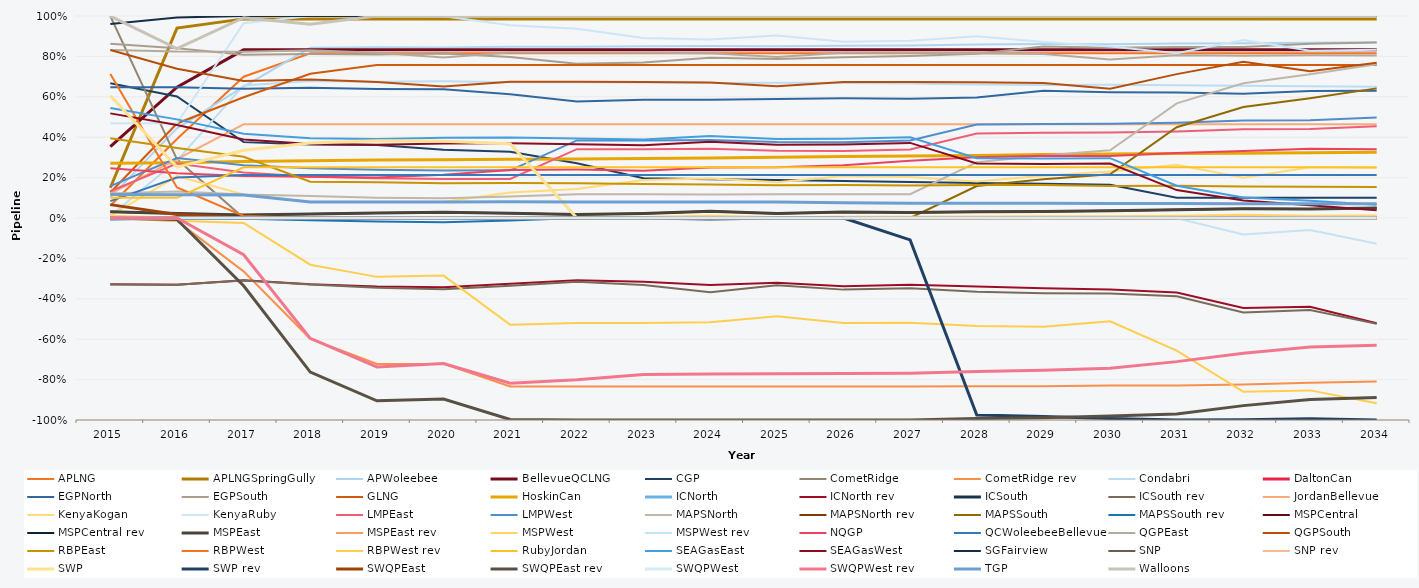
| Category | APLNG | APLNGSpringGully | APWoleebee | BellevueQCLNG | CGP | CometRidge | CometRidge rev | Condabri | DaltonCan | EGPNorth | EGPSouth | GLNG | HoskinCan | ICNorth | ICNorth rev | ICSouth | ICSouth rev | JordanBellevue | KenyaKogan | KenyaRuby | LMPEast | LMPWest | MAPSNorth | MAPSNorth rev | MAPSSouth | MAPSSouth rev | MSPCentral | MSPCentral rev | MSPEast | MSPEast rev | MSPWest | MSPWest rev | NQGP | QCWoleebeeBellevue | QGPEast | QGPSouth | RBPEast | RBPWest | RBPWest rev | RubyJordan | SEAGasEast | SEAGasWest | SGFairview | SNP | SNP rev | SWP | SWP rev | SWQPEast | SWQPEast rev | SWQPWest | SWQPWest rev | TGP | Walloons |
|---|---|---|---|---|---|---|---|---|---|---|---|---|---|---|---|---|---|---|---|---|---|---|---|---|---|---|---|---|---|---|---|---|---|---|---|---|---|---|---|---|---|---|---|---|---|---|---|---|---|---|---|---|---|
| 2015.0 | 0.061 | 0.15 | 0.102 | 0.353 | 0.667 | 1 | 0 | 0.01 | 0 | 0.647 | 0.863 | 0.127 | 0.272 | 0 | -0.328 | 0 | -0.329 | 0.12 | 0.011 | 0.469 | 0.132 | 0.158 | 0.121 | 0 | 0.001 | -0.007 | 0.031 | 0 | 0.031 | 0 | 0.011 | 0 | 0.247 | 0.083 | 0.832 | 0.832 | 0.395 | 0.713 | 0 | 0.1 | 0.545 | 0.518 | 0.961 | 0 | 0 | 0.605 | 0 | 0.066 | 0 | 0 | 0 | 0.117 | 0.999 |
| 2016.0 | 0.391 | 0.94 | 0.444 | 0.648 | 0.602 | 0.29 | -0.015 | 0.284 | 0 | 0.647 | 0.841 | 0.468 | 0.273 | 0 | -0.33 | 0 | -0.33 | 0.292 | 0.208 | 0.469 | 0.269 | 0.297 | 0.132 | 0 | 0 | -0.002 | 0.022 | 0 | 0.022 | 0 | 0.001 | 0 | 0.222 | 0.2 | 0.824 | 0.739 | 0.346 | 0.151 | -0.014 | 0.1 | 0.488 | 0.46 | 0.993 | 0 | 0 | 0.252 | 0 | 0.017 | -0.007 | 0 | 0 | 0.115 | 0.839 |
| 2017.0 | 0.7 | 0.986 | 0.651 | 0.833 | 0.376 | 0 | -0.264 | 0.656 | 0 | 0.64 | 0.809 | 0.597 | 0.28 | 0 | -0.309 | 0 | -0.309 | 0.464 | 0.116 | 0.964 | 0.225 | 0.261 | 0.116 | 0 | 0 | -0.004 | 0.015 | 0 | 0.015 | 0 | 0 | 0 | 0.208 | 0.213 | 0.823 | 0.678 | 0.303 | 0.01 | -0.025 | 0.251 | 0.417 | 0.389 | 1 | 0 | 0 | 0.335 | 0 | 0 | -0.335 | 0 | -0.182 | 0.113 | 0.991 |
| 2018.0 | 0.816 | 0.986 | 0.842 | 0.833 | 0.363 | 0 | -0.598 | 0.678 | 0 | 0.644 | 0.812 | 0.714 | 0.284 | 0 | -0.328 | 0 | -0.33 | 0.464 | 0.08 | 1 | 0.204 | 0.246 | 0.109 | 0 | 0 | -0.011 | 0.02 | 0 | 0.02 | 0 | 0.001 | 0 | 0.204 | 0.213 | 0.83 | 0.685 | 0.18 | 0 | -0.231 | 0.251 | 0.395 | 0.367 | 1 | 0 | 0 | 0.371 | 0 | 0 | -0.763 | 0 | -0.596 | 0.079 | 0.96 |
| 2019.0 | 0.816 | 0.986 | 0.846 | 0.833 | 0.361 | 0 | -0.722 | 0.675 | 0 | 0.639 | 0.809 | 0.758 | 0.287 | 0 | -0.339 | 0 | -0.346 | 0.464 | 0.08 | 1 | 0.197 | 0.239 | 0.1 | 0 | 0 | -0.018 | 0.025 | 0 | 0.025 | 0 | 0.002 | 0 | 0.2 | 0.213 | 0.818 | 0.673 | 0.177 | 0 | -0.291 | 0.251 | 0.391 | 0.363 | 1 | 0 | 0 | 0.383 | 0 | 0 | -0.905 | 0 | -0.737 | 0.08 | 1 |
| 2020.0 | 0.816 | 0.986 | 0.844 | 0.833 | 0.338 | 0 | -0.722 | 0.676 | 0 | 0.638 | 0.814 | 0.758 | 0.288 | 0 | -0.343 | 0 | -0.353 | 0.464 | 0.081 | 0.999 | 0.193 | 0.236 | 0.098 | 0 | 0 | -0.02 | 0.029 | 0 | 0.029 | 0 | 0.004 | 0 | 0.214 | 0.213 | 0.795 | 0.65 | 0.172 | 0 | -0.285 | 0.251 | 0.397 | 0.369 | 1 | 0 | 0 | 0.38 | 0 | 0 | -0.897 | 0 | -0.721 | 0.08 | 1 |
| 2021.0 | 0.816 | 0.986 | 0.848 | 0.833 | 0.327 | 0 | -0.834 | 0.672 | 0 | 0.612 | 0.798 | 0.758 | 0.291 | 0 | -0.326 | 0 | -0.336 | 0.464 | 0.126 | 0.954 | 0.193 | 0.236 | 0.106 | 0 | 0 | -0.012 | 0.023 | 0 | 0.023 | 0 | 0.004 | 0 | 0.238 | 0.213 | 0.819 | 0.674 | 0.173 | 0 | -0.528 | 0.251 | 0.399 | 0.371 | 1 | 0 | 0 | 0.368 | 0 | 0 | -0.998 | 0 | -0.818 | 0.08 | 1 |
| 2022.0 | 0.816 | 0.986 | 0.848 | 0.833 | 0.271 | 0 | -0.834 | 0.672 | 0 | 0.576 | 0.763 | 0.758 | 0.292 | 0 | -0.308 | 0 | -0.315 | 0.464 | 0.144 | 0.936 | 0.341 | 0.384 | 0.118 | 0 | 0 | 0 | 0.018 | 0 | 0.018 | 0 | 0.002 | 0 | 0.24 | 0.213 | 0.819 | 0.674 | 0.172 | 0 | -0.52 | 0.251 | 0.393 | 0.365 | 1 | 0 | 0 | 0 | 0 | 0 | -1 | 0 | -0.8 | 0.08 | 1 |
| 2023.0 | 0.816 | 0.986 | 0.85 | 0.833 | 0.197 | 0 | -0.834 | 0.67 | 0 | 0.585 | 0.77 | 0.758 | 0.295 | 0 | -0.316 | 0 | -0.332 | 0.464 | 0.188 | 0.892 | 0.34 | 0.383 | 0.117 | 0 | 0 | 0 | 0.023 | 0 | 0.023 | 0 | 0.005 | 0 | 0.234 | 0.213 | 0.818 | 0.674 | 0.168 | 0 | -0.52 | 0.251 | 0.388 | 0.36 | 1 | 0 | 0 | 0 | 0 | 0 | -1 | 0 | -0.774 | 0.08 | 1 |
| 2024.0 | 0.816 | 0.986 | 0.852 | 0.833 | 0.192 | 0 | -0.834 | 0.669 | 0 | 0.586 | 0.793 | 0.758 | 0.297 | 0 | -0.332 | 0 | -0.367 | 0.464 | 0.196 | 0.884 | 0.343 | 0.386 | 0.117 | 0 | 0 | -0.001 | 0.033 | 0 | 0.033 | 0 | 0.011 | 0 | 0.251 | 0.213 | 0.816 | 0.671 | 0.165 | 0 | -0.516 | 0.251 | 0.406 | 0.377 | 1 | 0 | 0 | 0 | -0.005 | 0 | -1 | 0 | -0.773 | 0.079 | 1 |
| 2025.0 | 0.816 | 0.986 | 0.851 | 0.833 | 0.188 | 0 | -0.834 | 0.67 | 0 | 0.589 | 0.787 | 0.758 | 0.301 | 0 | -0.32 | 0 | -0.333 | 0.464 | 0.177 | 0.903 | 0.333 | 0.376 | 0.118 | 0 | 0 | 0 | 0.022 | 0 | 0.022 | 0 | 0.003 | 0 | 0.251 | 0.213 | 0.796 | 0.652 | 0.162 | 0 | -0.486 | 0.251 | 0.391 | 0.363 | 1 | 0 | 0 | 0 | 0 | 0 | -1 | 0 | -0.771 | 0.079 | 1 |
| 2026.0 | 0.816 | 0.986 | 0.852 | 0.833 | 0.183 | 0 | -0.834 | 0.668 | 0 | 0.593 | 0.795 | 0.758 | 0.304 | 0 | -0.338 | 0 | -0.355 | 0.464 | 0.208 | 0.872 | 0.331 | 0.375 | 0.118 | 0 | 0 | 0 | 0.029 | 0 | 0.029 | 0 | 0.006 | 0 | 0.261 | 0.213 | 0.818 | 0.673 | 0.163 | 0 | -0.519 | 0.251 | 0.393 | 0.364 | 1 | 0 | 0 | 0 | 0 | 0 | -1 | 0 | -0.77 | 0.076 | 1 |
| 2027.0 | 0.816 | 0.986 | 0.854 | 0.833 | 0.179 | 0 | -0.834 | 0.666 | 0 | 0.59 | 0.802 | 0.758 | 0.307 | 0 | -0.331 | 0 | -0.348 | 0.464 | 0.203 | 0.877 | 0.34 | 0.384 | 0.118 | 0 | 0 | 0 | 0.027 | 0 | 0.027 | 0 | 0.006 | 0 | 0.283 | 0.213 | 0.818 | 0.674 | 0.161 | 0 | -0.519 | 0.251 | 0.4 | 0.372 | 1 | 0 | 0 | 0 | -0.108 | 0 | -1 | 0 | -0.768 | 0.073 | 1 |
| 2028.0 | 0.816 | 0.986 | 0.859 | 0.833 | 0.174 | 0 | -0.833 | 0.661 | 0 | 0.596 | 0.813 | 0.758 | 0.31 | 0 | -0.34 | 0 | -0.366 | 0.464 | 0.18 | 0.9 | 0.418 | 0.462 | 0.276 | 0 | 0.158 | 0 | 0.031 | 0 | 0.031 | 0 | 0.008 | 0 | 0.301 | 0.213 | 0.816 | 0.671 | 0.163 | 0 | -0.534 | 0.251 | 0.296 | 0.27 | 1 | 0 | 0 | 0 | -0.975 | 0 | -0.993 | 0 | -0.759 | 0.073 | 1 |
| 2029.0 | 0.816 | 0.986 | 0.861 | 0.833 | 0.17 | 0 | -0.833 | 0.659 | 0 | 0.63 | 0.849 | 0.758 | 0.314 | 0 | -0.348 | 0 | -0.372 | 0.464 | 0.209 | 0.871 | 0.421 | 0.465 | 0.31 | 0 | 0.191 | 0 | 0.033 | 0 | 0.033 | 0 | 0.008 | -0.002 | 0.309 | 0.213 | 0.812 | 0.668 | 0.163 | 0 | -0.538 | 0.251 | 0.295 | 0.268 | 1 | 0 | 0 | 0 | -0.982 | 0 | -0.989 | 0 | -0.754 | 0.073 | 1 |
| 2030.0 | 0.816 | 0.986 | 0.861 | 0.833 | 0.165 | 0 | -0.83 | 0.659 | 0 | 0.623 | 0.842 | 0.758 | 0.317 | 0 | -0.354 | 0 | -0.374 | 0.464 | 0.231 | 0.849 | 0.423 | 0.467 | 0.335 | 0 | 0.217 | 0 | 0.036 | 0 | 0.036 | 0 | 0.009 | 0 | 0.306 | 0.213 | 0.785 | 0.64 | 0.158 | 0 | -0.511 | 0.251 | 0.296 | 0.27 | 1 | 0 | 0 | 0 | -0.993 | 0 | -0.98 | 0 | -0.744 | 0.072 | 1 |
| 2031.0 | 0.816 | 0.986 | 0.863 | 0.833 | 0.101 | 0 | -0.83 | 0.657 | 0 | 0.622 | 0.846 | 0.758 | 0.32 | 0 | -0.369 | 0 | -0.387 | 0.464 | 0.264 | 0.816 | 0.428 | 0.471 | 0.568 | 0 | 0.449 | 0 | 0.041 | 0 | 0.041 | 0 | 0.011 | -0.001 | 0.321 | 0.213 | 0.806 | 0.712 | 0.159 | 0 | -0.657 | 0.251 | 0.16 | 0.138 | 1 | 0 | 0 | 0 | -0.999 | 0 | -0.97 | 0 | -0.711 | 0.071 | 1 |
| 2032.0 | 0.816 | 0.986 | 0.865 | 0.833 | 0.1 | 0 | -0.824 | 0.655 | 0 | 0.616 | 0.846 | 0.758 | 0.321 | 0 | -0.446 | 0 | -0.468 | 0.464 | 0.199 | 0.881 | 0.439 | 0.483 | 0.667 | 0 | 0.549 | 0 | 0.045 | 0 | 0.045 | 0 | 0.016 | -0.081 | 0.331 | 0.213 | 0.804 | 0.773 | 0.156 | 0 | -0.86 | 0.251 | 0.101 | 0.086 | 1 | 0 | 0 | 0 | -0.999 | 0 | -0.929 | 0 | -0.67 | 0.071 | 1 |
| 2033.0 | 0.816 | 0.986 | 0.867 | 0.833 | 0.1 | 0 | -0.816 | 0.653 | 0 | 0.629 | 0.863 | 0.758 | 0.324 | 0 | -0.439 | 0 | -0.455 | 0.464 | 0.252 | 0.828 | 0.441 | 0.484 | 0.712 | 0 | 0.593 | 0 | 0.045 | 0 | 0.045 | 0 | 0.011 | -0.059 | 0.343 | 0.213 | 0.805 | 0.726 | 0.155 | 0 | -0.853 | 0.251 | 0.086 | 0.063 | 1 | 0 | 0 | 0 | -0.994 | 0 | -0.898 | 0 | -0.639 | 0.07 | 0.999 |
| 2034.0 | 0.816 | 0.986 | 0.87 | 0.833 | 0.1 | 0 | -0.809 | 0.65 | 0 | 0.63 | 0.869 | 0.758 | 0.325 | 0 | -0.521 | 0 | -0.524 | 0.464 | 0.247 | 0.833 | 0.454 | 0.497 | 0.761 | 0 | 0.642 | 0 | 0.05 | 0 | 0.05 | 0 | 0.013 | -0.128 | 0.341 | 0.213 | 0.805 | 0.768 | 0.153 | 0 | -0.917 | 0.251 | 0.065 | 0.038 | 1 | 0 | 0 | 0 | -1 | 0 | -0.889 | 0 | -0.63 | 0.07 | 0.999 |